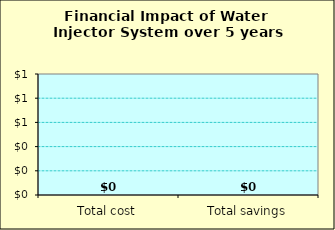
| Category | Series 0 |
|---|---|
| Total cost | 0 |
| Total savings | 0 |